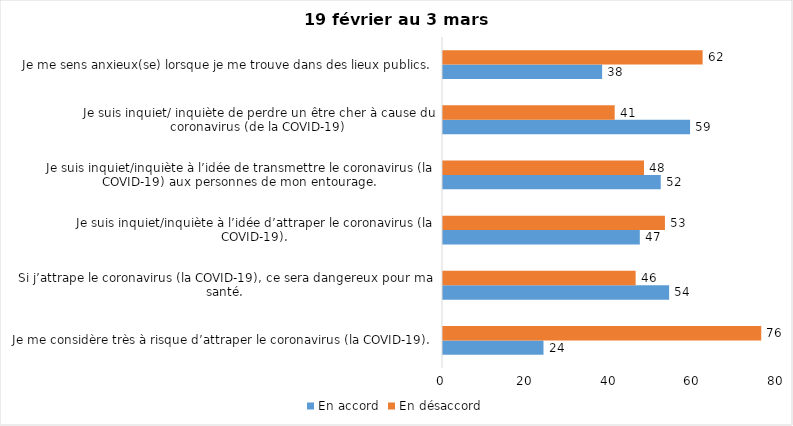
| Category | En accord | En désaccord |
|---|---|---|
| Je me considère très à risque d’attraper le coronavirus (la COVID-19). | 24 | 76 |
| Si j’attrape le coronavirus (la COVID-19), ce sera dangereux pour ma santé. | 54 | 46 |
| Je suis inquiet/inquiète à l’idée d’attraper le coronavirus (la COVID-19). | 47 | 53 |
| Je suis inquiet/inquiète à l’idée de transmettre le coronavirus (la COVID-19) aux personnes de mon entourage. | 52 | 48 |
| Je suis inquiet/ inquiète de perdre un être cher à cause du coronavirus (de la COVID-19) | 59 | 41 |
| Je me sens anxieux(se) lorsque je me trouve dans des lieux publics. | 38 | 62 |